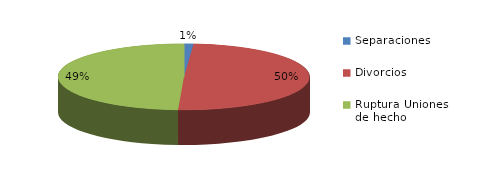
| Category | Series 0 |
|---|---|
| Separaciones | 21 |
| Divorcios | 860 |
| Ruptura Uniones de hecho | 855 |